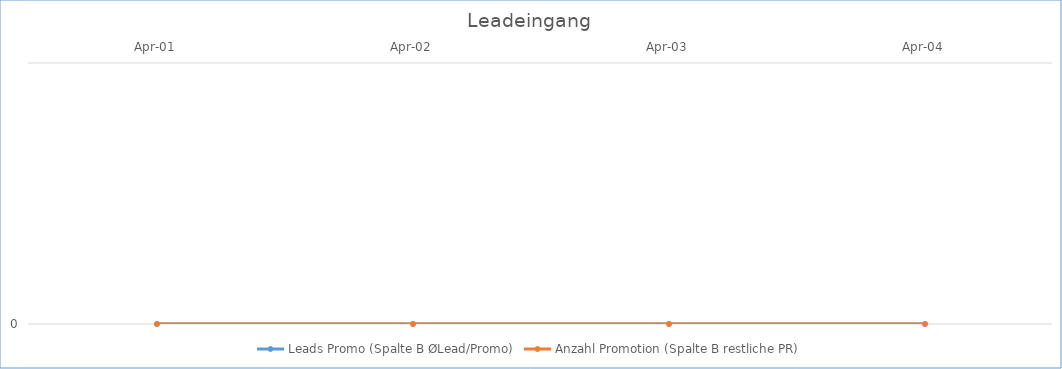
| Category | Leads Promo (Spalte B ØLead/Promo) | Anzahl Promotion (Spalte B restliche PR) |
|---|---|---|
| 2001-04-01 | 0 | 0 |
| 2002-04-01 | 0 | 0 |
| 2003-04-01 | 0 | 0 |
| 2004-04-01 | 0 | 0 |